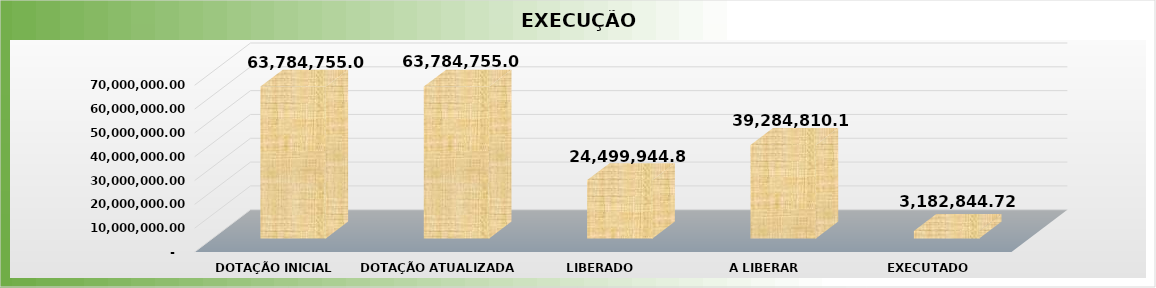
| Category | Series 0 |
|---|---|
| 0 | 63784755 |
| 1 | 63784755 |
| 2 | 24499944.86 |
| 3 | 39284810.14 |
| 4 | 3182844.72 |